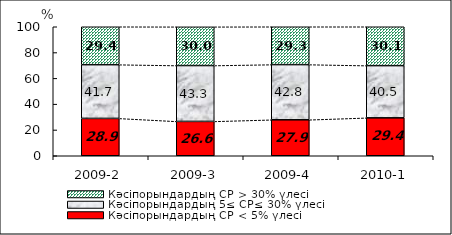
| Category | Кәсіпорындардың СР < 5% үлесі | Кәсіпорындардың 5≤ СР≤ 30% үлесі | Кәсіпорындардың СР > 30% үлесі |
|---|---|---|---|
| 2009-2 | 28.94 | 41.66 | 29.4 |
| 2009-3 | 26.63 | 43.3 | 30.01 |
| 2009-4 | 27.88 | 42.78 | 29.34 |
| 2010-1 | 29.39 | 40.48 | 30.13 |